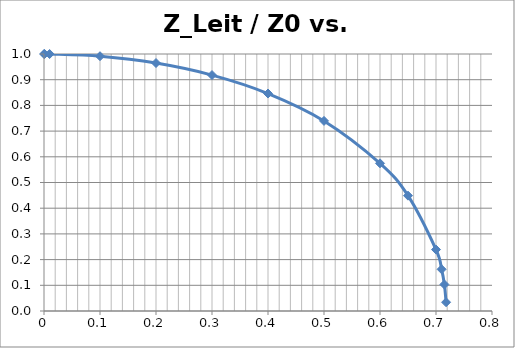
| Category | Z_Leit / Z0 |
|---|---|
| 0.0001 | 1 |
| 0.001 | 1 |
| 0.01 | 1 |
| 0.1 | 0.991 |
| 0.2 | 0.965 |
| 0.3 | 0.918 |
| 0.4 | 0.846 |
| 0.5 | 0.74 |
| 0.6 | 0.575 |
| 0.65 | 0.449 |
| 0.7 | 0.239 |
| 0.71 | 0.162 |
| 0.715 | 0.103 |
| 0.718 | 0.034 |